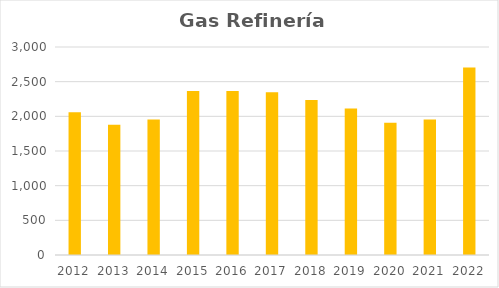
| Category | Series 0 |
|---|---|
| 2012.0 | 2059.343 |
| 2013.0 | 1879.574 |
| 2014.0 | 1955.368 |
| 2015.0 | 2363.979 |
| 2016.0 | 2365.874 |
| 2017.0 | 2346.299 |
| 2018.0 | 2236.378 |
| 2019.0 | 2113.336 |
| 2020.0 | 1907.335 |
| 2021.0 | 1952.643 |
| 2022.0 | 2704.739 |